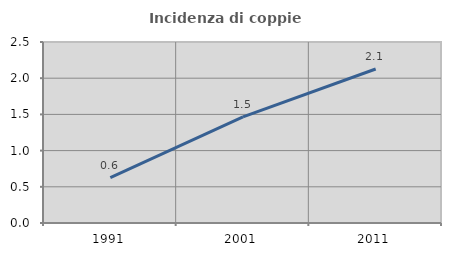
| Category | Incidenza di coppie miste |
|---|---|
| 1991.0 | 0.625 |
| 2001.0 | 1.465 |
| 2011.0 | 2.127 |